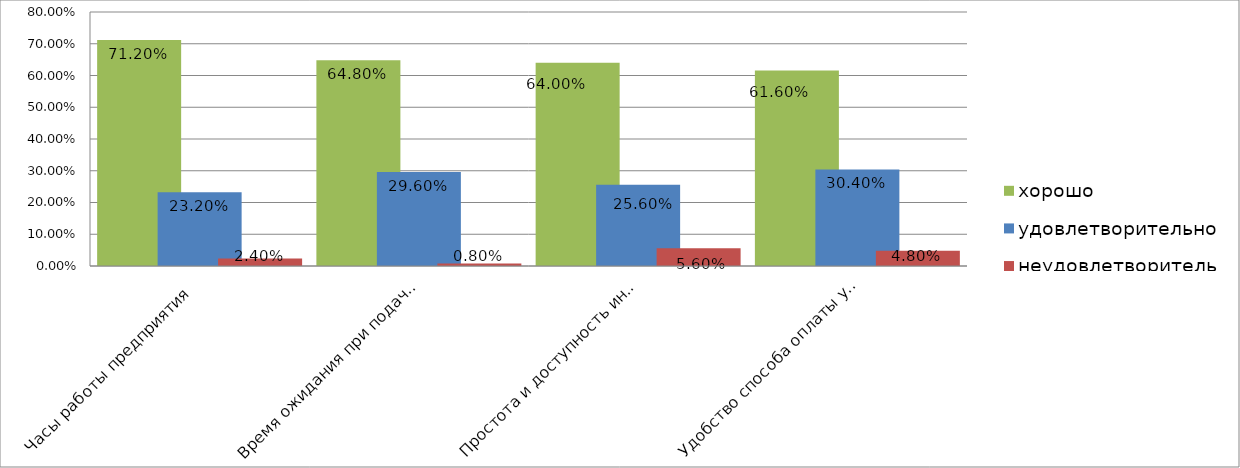
| Category | хорошо | удовлетворительно | неудовлетворительно |
|---|---|---|---|
| Часы работы предприятия  | 0.712 | 0.232 | 0.024 |
| Время ожидания при подаче заявки  | 0.648 | 0.296 | 0.008 |
| Простота и доступность информационно-справочных материалов, необходимых для оформления заявки  | 0.64 | 0.256 | 0.056 |
| Удобство способа оплаты услуг, предоставляемых предприятием  | 0.616 | 0.304 | 0.048 |